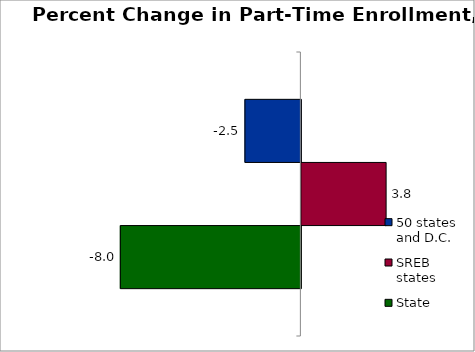
| Category | 50 states and D.C. | SREB states | State |
|---|---|---|---|
| 0 | -2.493 | 3.777 | -8.047 |